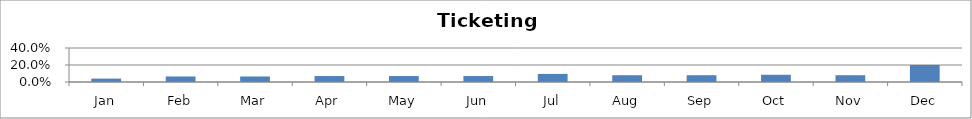
| Category | Series 0 |
|---|---|
| Jan | 0.04 |
| Feb | 0.065 |
| Mar | 0.065 |
| Apr | 0.07 |
| May | 0.07 |
| Jun | 0.07 |
| Jul | 0.095 |
| Aug | 0.08 |
| Sep | 0.08 |
| Oct | 0.085 |
| Nov | 0.08 |
| Dec | 0.2 |